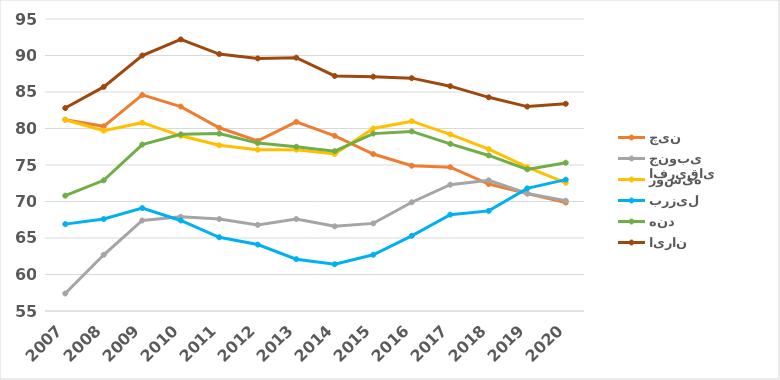
| Category | چین | افریقای جنوبی | روسیه | برزیل | هند | ایران |
|---|---|---|---|---|---|---|
| 2007.0 | 81.2 | 57.4 | 81.2 | 66.9 | 70.8 | 82.8 |
| 2008.0 | 80.3 | 62.7 | 79.7 | 67.6 | 72.9 | 85.7 |
| 2009.0 | 84.6 | 67.4 | 80.8 | 69.1 | 77.8 | 90 |
| 2010.0 | 83 | 67.9 | 79 | 67.4 | 79.2 | 92.2 |
| 2011.0 | 80.1 | 67.6 | 77.7 | 65.1 | 79.3 | 90.2 |
| 2012.0 | 78.3 | 66.8 | 77.1 | 64.1 | 78 | 89.6 |
| 2013.0 | 80.9 | 67.6 | 77.1 | 62.1 | 77.5 | 89.7 |
| 2014.0 | 79 | 66.6 | 76.5 | 61.4 | 76.9 | 87.2 |
| 2015.0 | 76.5 | 67 | 80 | 62.7 | 79.3 | 87.1 |
| 2016.0 | 74.9 | 69.9 | 81 | 65.3 | 79.6 | 86.9 |
| 2017.0 | 74.7 | 72.3 | 79.2 | 68.2 | 77.9 | 85.8 |
| 2018.0 | 72.395 | 72.9 | 77.165 | 68.713 | 76.309 | 84.271 |
| 2019.0 | 71.1 | 71.1 | 74.7 | 71.8 | 74.4 | 83 |
| 2020.0 | 69.859 | 70.107 | 72.559 | 72.994 | 75.307 | 83.387 |